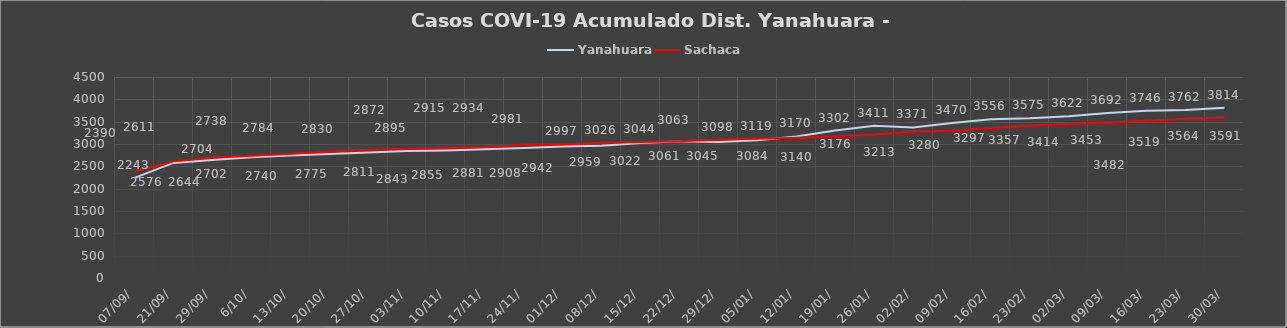
| Category | Yanahuara | Sachaca |
|---|---|---|
| 07/09/ | 2243 | 2390 |
| 21/09/ | 2576 | 2611 |
| 29/09/ | 2644 | 2704 |
| 6/10/ | 2702 | 2738 |
| 13/10/ | 2740 | 2784 |
| 20/10/ | 2775 | 2830 |
| 27/10/ | 2811 | 2872 |
| 03/11/ | 2843 | 2895 |
| 10/11/ | 2855 | 2915 |
| 17/11/ | 2881 | 2934 |
| 24/11/ | 2908 | 2981 |
| 01/12/ | 2942 | 2997 |
| 08/12/ | 2959 | 3026 |
| 15/12/ | 3022 | 3044 |
| 22/12/ | 3061 | 3063 |
| 29/12/ | 3045 | 3098 |
| 05/01/ | 3084 | 3119 |
| 12/01/ | 3170 | 3140 |
| 19/01/ | 3302 | 3176 |
| 26/01/ | 3411 | 3213 |
| 02/02/ | 3371 | 3280 |
| 09/02/ | 3470 | 3297 |
| 16/02/ | 3556 | 3357 |
| 23/02/ | 3575 | 3414 |
| 02/03/ | 3622 | 3453 |
| 09/03/ | 3692 | 3482 |
| 16/03/ | 3746 | 3519 |
| 23/03/ | 3762 | 3564 |
| 30/03/ | 3814 | 3591 |